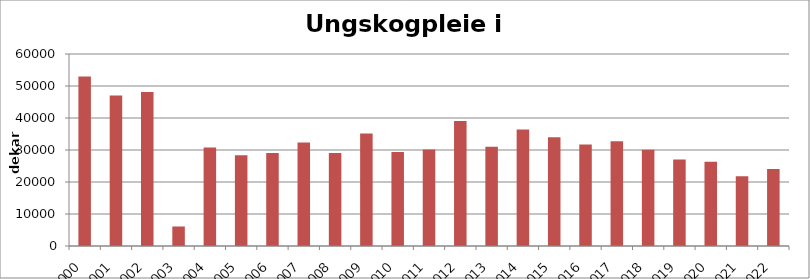
| Category | Totalt |
|---|---|
| 2000 | 53002 |
| 2001 | 47067 |
| 2002 | 48097 |
| 2003 | 6098 |
| 2004 | 30775 |
| 2005 | 28368 |
| 2006 | 29042 |
| 2007 | 32376 |
| 2008 | 29052 |
| 2009 | 35119 |
| 2010 | 29372 |
| 2011 | 30175 |
| 2012 | 39025 |
| 2013 | 31034 |
| 2014 | 36422 |
| 2015 | 33951 |
| 2016 | 31710 |
| 2017 | 32719 |
| 2018 | 30089 |
| 2019 | 27019 |
| 2020 | 26303 |
| 2021 | 21827 |
| 2022 | 24044 |